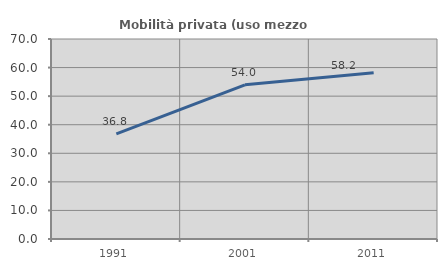
| Category | Mobilità privata (uso mezzo privato) |
|---|---|
| 1991.0 | 36.773 |
| 2001.0 | 53.971 |
| 2011.0 | 58.201 |